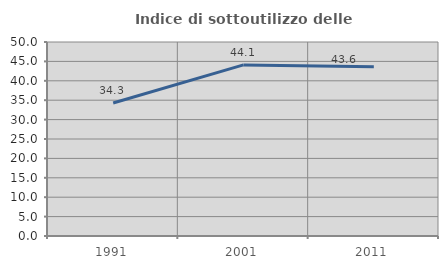
| Category | Indice di sottoutilizzo delle abitazioni  |
|---|---|
| 1991.0 | 34.286 |
| 2001.0 | 44.095 |
| 2011.0 | 43.625 |